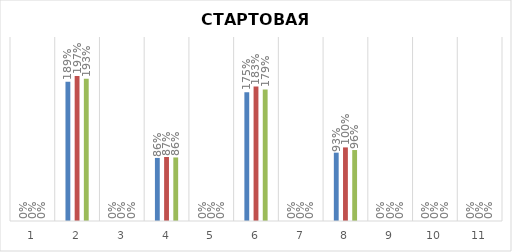
| Category | Параллель А | Параллель Б | Обе параллели |
|---|---|---|---|
| 0 | 0 | 0 | 0 |
| 1 | 1.893 | 1.971 | 1.932 |
| 2 | 0 | 0 | 0 |
| 3 | 0.857 | 0.87 | 0.863 |
| 4 | 0 | 0 | 0 |
| 5 | 1.75 | 1.826 | 1.788 |
| 6 | 0 | 0 | 0 |
| 7 | 0.929 | 1 | 0.964 |
| 8 | 0 | 0 | 0 |
| 9 | 0 | 0 | 0 |
| 10 | 0 | 0 | 0 |